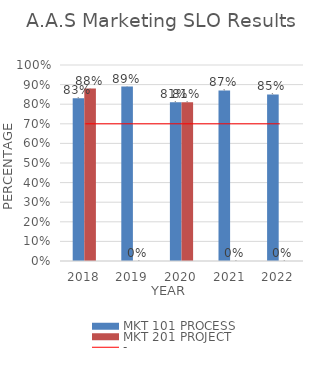
| Category | MKT 101 PROCESS | MKT 201 PROJECT |
|---|---|---|
| 0 | 0.83 | 0.88 |
| 1 | 0.89 | 0 |
| 2 | 0.81 | 0.81 |
| 3 | 0.87 | 0 |
| 4 | 0.85 | 0 |